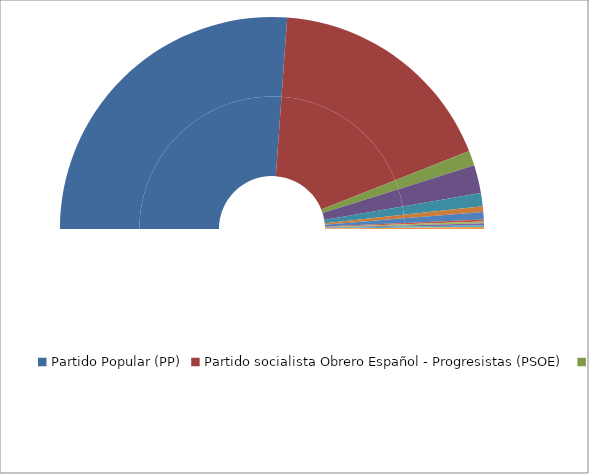
| Category | Series 0 | Series 1 |
|---|---|---|
| Partido Popular (PP) | 183 | 52.286 |
| Partido socialista Obrero Español - Progresistas (PSOE) | 125 | 35.714 |
| Izquierda Unida (IU) | 8 | 2.286 |
| Convergència i Unió (CiU) | 15 | 4.286 |
| Euzko Alderdi Jeltzalea-Partido Nacionalista Vasco (EAJ-PNV) | 7 | 2 |
| Bloque Nacionalista Galego (BNG) | 3 | 0.857 |
| Coalición Canaria (CC) | 4 | 1.143 |
| Partido Andalucista (PA) | 1 | 0.286 |
| Esquerra Republicana de Catalunya (ERC) | 1 | 0.286 |
| Iniciativa per Catalunya-Verds (IC-V) | 1 | 0.286 |
| Eusko Alkartasuna (EA) | 1 | 0.286 |
| Chunta Aragonesista (CHA) | 1 | 0.286 |